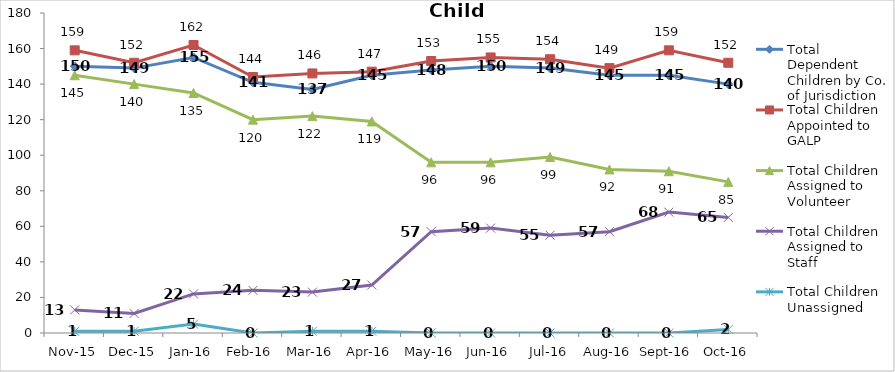
| Category | Total Dependent Children by Co. of Jurisdiction | Total Children Appointed to GALP | Total Children Assigned to Volunteer | Total Children Assigned to Staff | Total Children Unassigned |
|---|---|---|---|---|---|
| Nov-15 | 150 | 159 | 145 | 13 | 1 |
| Dec-15 | 149 | 152 | 140 | 11 | 1 |
| Jan-16 | 155 | 162 | 135 | 22 | 5 |
| Feb-16 | 141 | 144 | 120 | 24 | 0 |
| Mar-16 | 137 | 146 | 122 | 23 | 1 |
| Apr-16 | 145 | 147 | 119 | 27 | 1 |
| May-16 | 148 | 153 | 96 | 57 | 0 |
| Jun-16 | 150 | 155 | 96 | 59 | 0 |
| Jul-16 | 149 | 154 | 99 | 55 | 0 |
| Aug-16 | 145 | 149 | 92 | 57 | 0 |
| Sep-16 | 145 | 159 | 91 | 68 | 0 |
| Oct-16 | 140 | 152 | 85 | 65 | 2 |